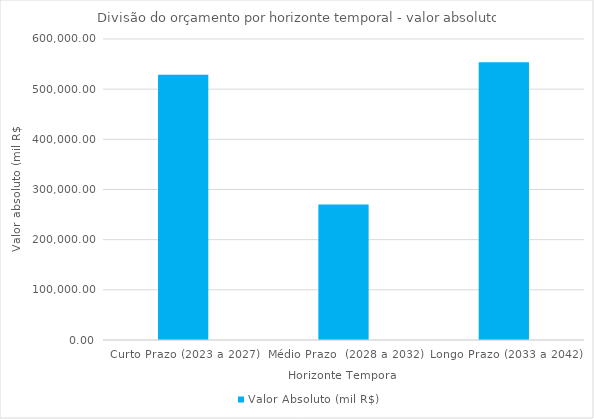
| Category | Valor Absoluto (mil R$) |
|---|---|
| Curto Prazo (2023 a 2027) | 528772.91 |
| Médio Prazo  (2028 a 2032) | 270146.21 |
| Longo Prazo (2033 a 2042) | 553845.419 |